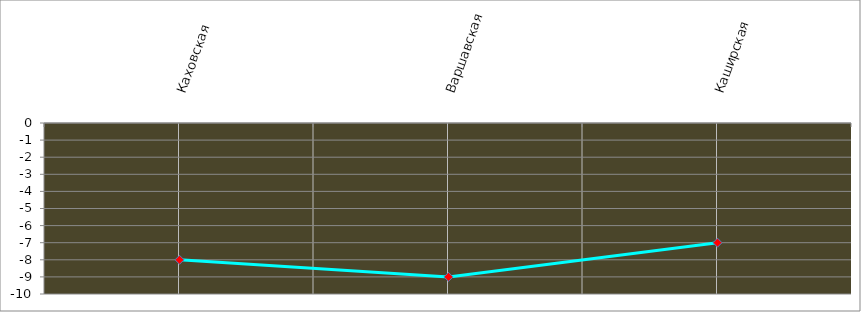
| Category | Series 0 |
|---|---|
| Каховская | -8 |
| Варшавская | -9 |
| Каширская | -7 |